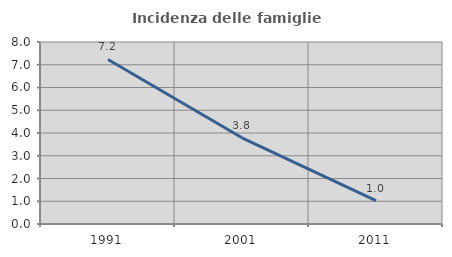
| Category | Incidenza delle famiglie numerose |
|---|---|
| 1991.0 | 7.234 |
| 2001.0 | 3.789 |
| 2011.0 | 1.027 |